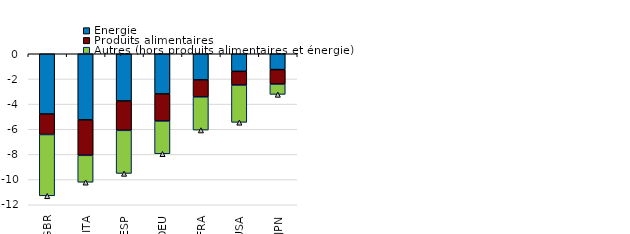
| Category | Énergie | Produits alimentaires | Autres (hors produits alimentaires et énergie) |
|---|---|---|---|
| GBR | -4.787 | -1.631 | -4.871 |
| ITA | -5.256 | -2.815 | -2.139 |
| ESP | -3.754 | -2.333 | -3.425 |
| DEU | -3.192 | -2.152 | -2.604 |
| FRA | -2.079 | -1.348 | -2.638 |
| USA | -1.398 | -1.088 | -2.964 |
| JPN | -1.259 | -1.15 | -0.821 |